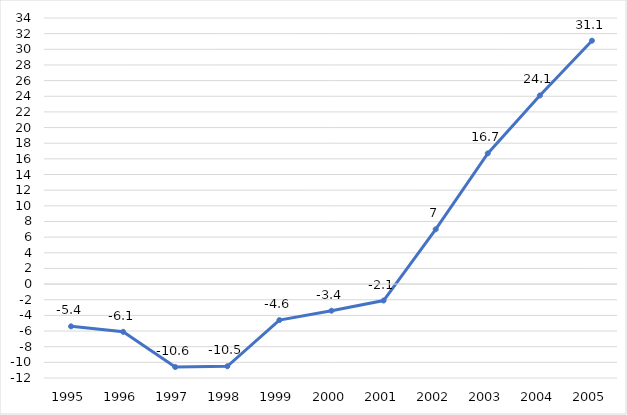
| Category | SALDO DA BALANÇA COMERCIAL DE PRODUTOS INDUSTRIAIS (US$ Bilhões) |
|---|---|
| 1995.0 | -5.4 |
| 1996.0 | -6.1 |
| 1997.0 | -10.6 |
| 1998.0 | -10.5 |
| 1999.0 | -4.6 |
| 2000.0 | -3.4 |
| 2001.0 | -2.1 |
| 2002.0 | 7 |
| 2003.0 | 16.7 |
| 2004.0 | 24.1 |
| 2005.0 | 31.1 |